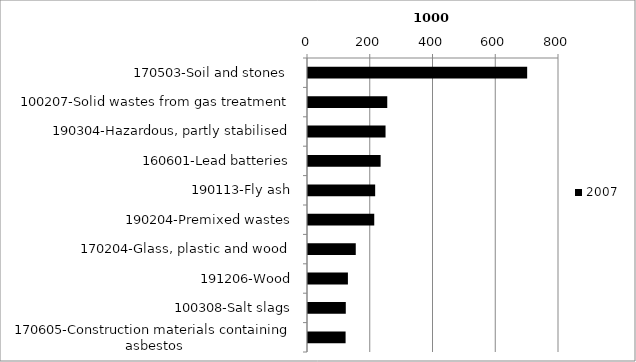
| Category | 2007 |
|---|---|
| 170503-Soil and stones  | 698.542 |
| 100207-Solid wastes from gas treatment | 252.62 |
| 190304-Hazardous, partly stabilised | 247.138 |
| 160601-Lead batteries | 231.454 |
| 190113-Fly ash | 214.072 |
| 190204-Premixed wastes | 211.144 |
| 170204-Glass, plastic and wood | 152.234 |
| 191206-Wood | 127.214 |
| 100308-Salt slags | 120.45 |
| 170605-Construction materials containing asbestos | 119.818 |